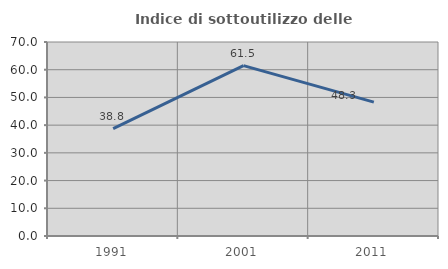
| Category | Indice di sottoutilizzo delle abitazioni  |
|---|---|
| 1991.0 | 38.76 |
| 2001.0 | 61.468 |
| 2011.0 | 48.315 |